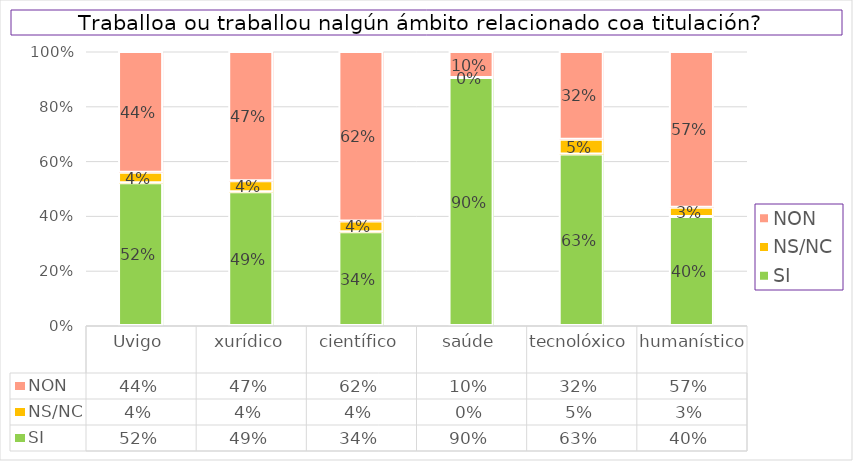
| Category | SI | NS/NC | NON |
|---|---|---|---|
| Uvigo | 0.521 | 0.039 | 0.441 |
| xurídico | 0.488 | 0.04 | 0.471 |
| científico | 0.342 | 0.039 | 0.618 |
| saúde | 0.905 | 0 | 0.095 |
| tecnolóxico | 0.626 | 0.053 | 0.321 |
| humanístico | 0.398 | 0.034 | 0.568 |